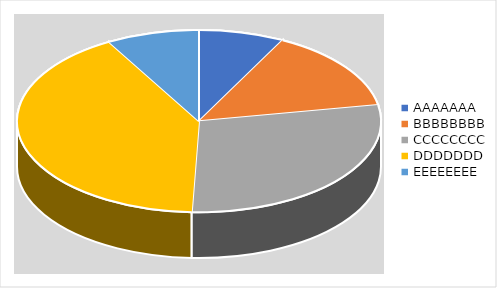
| Category | Series 0 |
|---|---|
| AAAAAAA | 12 |
| BBBBBBBB | 23 |
| CCCCCCCC | 45 |
| DDDDDDD | 65 |
| EEEEEEEE | 13 |